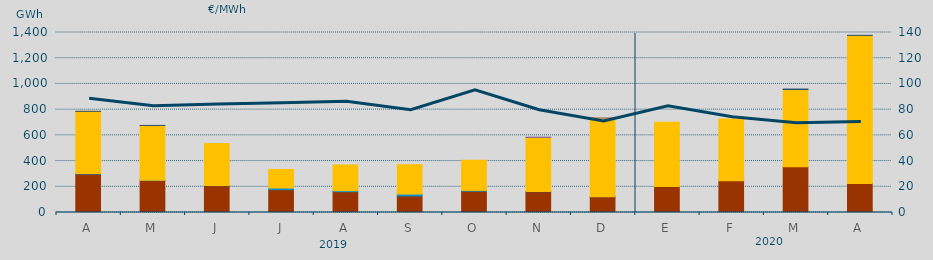
| Category | Turbinación bombeo | Carbón | Otras Renovables | Hidráulica | Ciclo Combinado | Consumo Bombeo |
|---|---|---|---|---|---|---|
| A | 0 | 299645.9 | 0 | 4315.4 | 482984.6 | 52 |
| M | 0 | 250250 | 0 | 880 | 425915 | 190 |
| J | 0 | 209003 | 0 | 334.5 | 326625.6 | 0 |
| J | 0 | 177655 | 0 | 12515 | 144531.3 | 0 |
| A | 0 | 161808 | 0 | 7890 | 199805.1 | 0 |
| S | 0 | 128712 | 0 | 14281 | 228795.2 | 0 |
| O | 0 | 166180 | 0 | 5517.1 | 234526.2 | 0 |
| N | 0 | 161365 | 1775.2 | 0 | 421030.7 | 0 |
| D | 0 | 122168 | 164.2 | 0 | 612250.1 | 0 |
| E | 0 | 202940 | 0 | 0 | 498564 | 0 |
| F | 0 | 247227 | 0 | 0 | 479450.3 | 0 |
| M | 0 | 355297 | 0 | 0 | 601360.3 | 3495.6 |
| A | 5000 | 220571 | 0 | 0 | 1152051.4 | 585 |